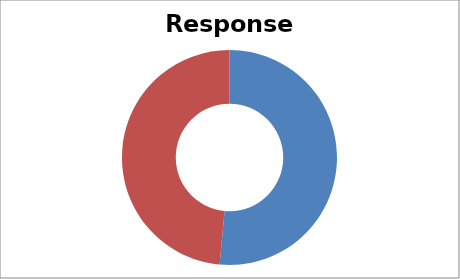
| Category | Total |
|---|---|
| Sum of Overall Response | 51.462 |
| Sum of Non-resp | 48.538 |